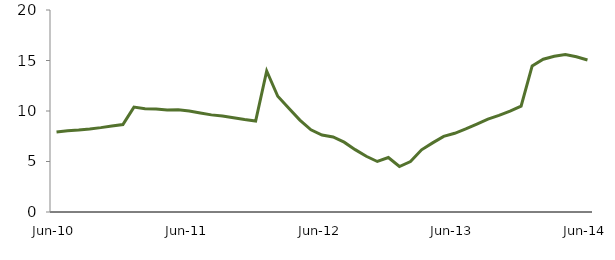
| Category | Series 0 |
|---|---|
| Jun-10 | 7.927 |
|  | 8.053 |
|  | 8.123 |
|  | 8.226 |
|  | 8.355 |
|  | 8.51 |
|  | 8.658 |
|  | 10.387 |
|  | 10.226 |
|  | 10.187 |
|  | 10.098 |
|  | 10.112 |
| Jun-11 | 9.997 |
|  | 9.799 |
|  | 9.617 |
|  | 9.496 |
|  | 9.328 |
|  | 9.151 |
|  | 9.003 |
|  | 13.958 |
|  | 11.462 |
|  | 10.275 |
|  | 9.102 |
|  | 8.135 |
| Jun-12 | 7.62 |
|  | 7.427 |
|  | 6.915 |
|  | 6.173 |
|  | 5.517 |
|  | 5.001 |
|  | 5.391 |
|  | 4.502 |
|  | 4.988 |
|  | 6.155 |
|  | 6.846 |
|  | 7.49 |
| Jun-13 | 7.793 |
|  | 8.223 |
|  | 8.703 |
|  | 9.197 |
|  | 9.564 |
|  | 9.978 |
|  | 10.478 |
|  | 14.467 |
|  | 15.129 |
|  | 15.422 |
|  | 15.593 |
|  | 15.372 |
| Jun-14 | 15.054 |